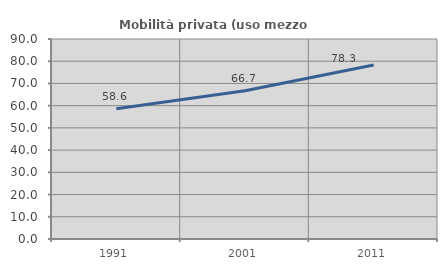
| Category | Mobilità privata (uso mezzo privato) |
|---|---|
| 1991.0 | 58.618 |
| 2001.0 | 66.722 |
| 2011.0 | 78.289 |